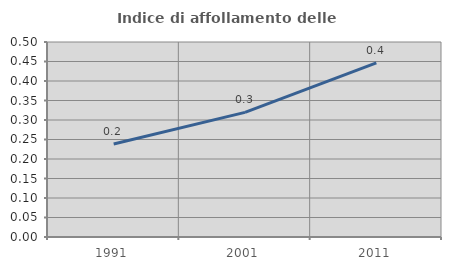
| Category | Indice di affollamento delle abitazioni  |
|---|---|
| 1991.0 | 0.238 |
| 2001.0 | 0.32 |
| 2011.0 | 0.447 |